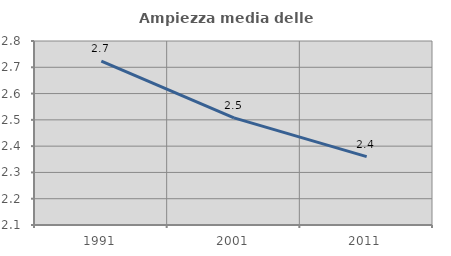
| Category | Ampiezza media delle famiglie |
|---|---|
| 1991.0 | 2.724 |
| 2001.0 | 2.508 |
| 2011.0 | 2.36 |